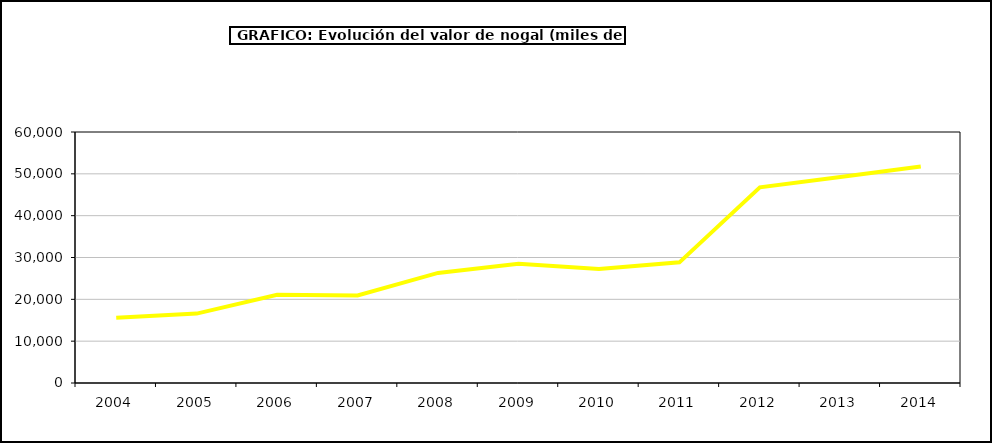
| Category | valor nogal |
|---|---|
| 2004.0 | 15596.797 |
| 2005.0 | 16588.39 |
| 2006.0 | 21082.074 |
| 2007.0 | 20930.205 |
| 2008.0 | 26319.546 |
| 2009.0 | 28498.427 |
| 2010.0 | 27232.257 |
| 2011.0 | 28841.576 |
| 2012.0 | 46777.981 |
| 2013.0 | 49217.301 |
| 2014.0 | 51776.04 |